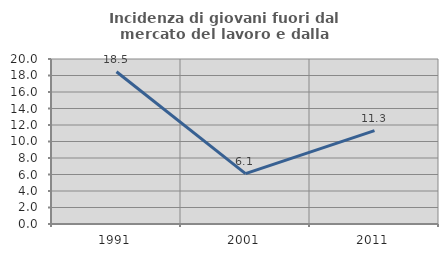
| Category | Incidenza di giovani fuori dal mercato del lavoro e dalla formazione  |
|---|---|
| 1991.0 | 18.455 |
| 2001.0 | 6.098 |
| 2011.0 | 11.321 |